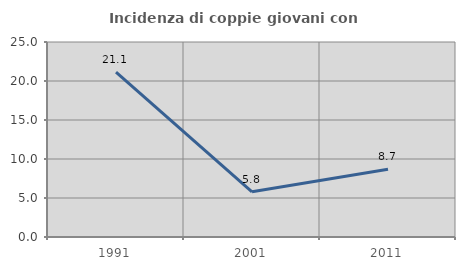
| Category | Incidenza di coppie giovani con figli |
|---|---|
| 1991.0 | 21.127 |
| 2001.0 | 5.797 |
| 2011.0 | 8.696 |